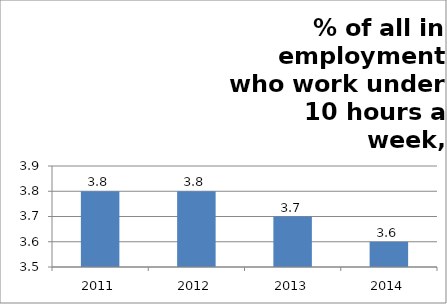
| Category | % of all in employment who work under 10 hours |
|---|---|
| 2011.0 | 3.8 |
| 2012.0 | 3.8 |
| 2013.0 | 3.7 |
| 2014.0 | 3.6 |